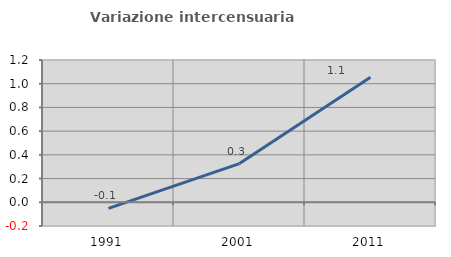
| Category | Variazione intercensuaria annua |
|---|---|
| 1991.0 | -0.051 |
| 2001.0 | 0.326 |
| 2011.0 | 1.055 |